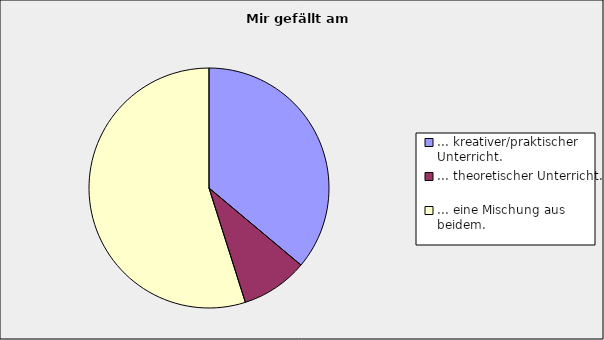
| Category | Series 0 |
|---|---|
| ... kreativer/praktischer Unterricht. | 0.361 |
| ... theoretischer Unterricht. | 0.09 |
| ... eine Mischung aus beidem. | 0.549 |